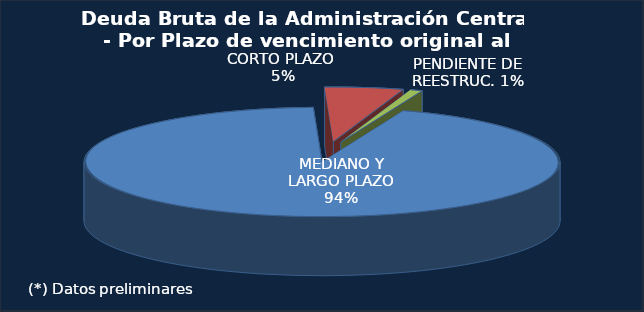
| Category | Series 0 |
|---|---|
| MEDIANO Y LARGO PLAZO | 292170 |
| CORTO PLAZO  | 16596 |
| DEUDA PENDIENTE DE REESTRUC. | 2520.6 |